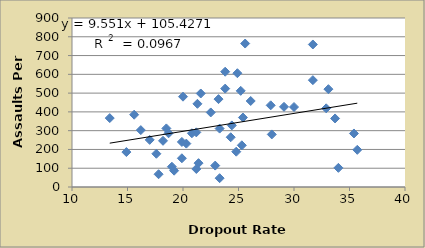
| Category | Series 0 |
|---|---|
| 33.1 | 521 |
| 13.4 | 367 |
| 21.3 | 443 |
| 33.7 | 365 |
| 23.8 | 614 |
| 15.6 | 385 |
| 20.8 | 286 |
| 22.5 | 397 |
| 25.6 | 764 |
| 29.1 | 427 |
| 19.9 | 153 |
| 20.3 | 231 |
| 23.8 | 524 |
| 24.4 | 328 |
| 19.9 | 240 |
| 18.7 | 286 |
| 35.4 | 285 |
| 31.7 | 569 |
| 21.2 | 96 |
| 21.6 | 498 |
| 20.0 | 481 |
| 23.2 | 468 |
| 17.6 | 177 |
| 35.7 | 198 |
| 26.1 | 458 |
| 19.0 | 108 |
| 18.2 | 246 |
| 21.2 | 291 |
| 17.8 | 68 |
| 23.3 | 311 |
| 24.9 | 606 |
| 25.2 | 512 |
| 30.0 | 426 |
| 23.3 | 47 |
| 24.3 | 265 |
| 25.4 | 370 |
| 18.5 | 312 |
| 25.3 | 222 |
| 28.0 | 280 |
| 31.7 | 759 |
| 22.9 | 114 |
| 32.9 | 419 |
| 27.9 | 435 |
| 14.9 | 186 |
| 19.2 | 87 |
| 24.8 | 188 |
| 16.2 | 303 |
| 34.0 | 102 |
| 21.4 | 127 |
| 17.0 | 251 |